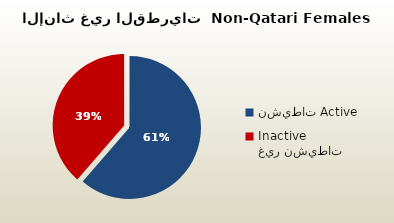
| Category | الاناث غير القطريات  Non-Qatari Females |
|---|---|
| نشيطات Active | 218886 |
| غير نشيطات Inactive | 137816 |